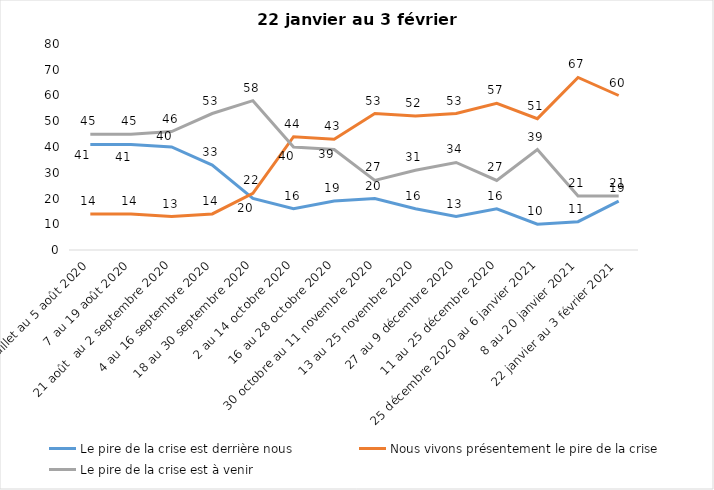
| Category | Le pire de la crise est derrière nous | Nous vivons présentement le pire de la crise | Le pire de la crise est à venir |
|---|---|---|---|
| 24 juillet au 5 août 2020 | 41 | 14 | 45 |
| 7 au 19 août 2020 | 41 | 14 | 45 |
| 21 août  au 2 septembre 2020 | 40 | 13 | 46 |
| 4 au 16 septembre 2020 | 33 | 14 | 53 |
| 18 au 30 septembre 2020 | 20 | 22 | 58 |
| 2 au 14 octobre 2020 | 16 | 44 | 40 |
| 16 au 28 octobre 2020 | 19 | 43 | 39 |
| 30 octobre au 11 novembre 2020 | 20 | 53 | 27 |
| 13 au 25 novembre 2020 | 16 | 52 | 31 |
| 27 au 9 décembre 2020 | 13 | 53 | 34 |
| 11 au 25 décembre 2020 | 16 | 57 | 27 |
| 25 décembre 2020 au 6 janvier 2021 | 10 | 51 | 39 |
| 8 au 20 janvier 2021 | 11 | 67 | 21 |
| 22 janvier au 3 février 2021 | 19 | 60 | 21 |